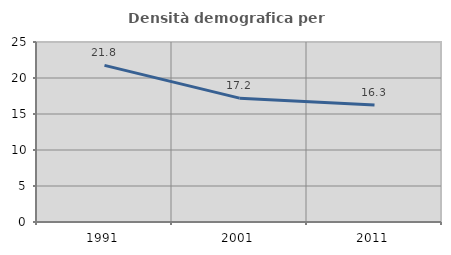
| Category | Densità demografica |
|---|---|
| 1991.0 | 21.752 |
| 2001.0 | 17.199 |
| 2011.0 | 16.26 |